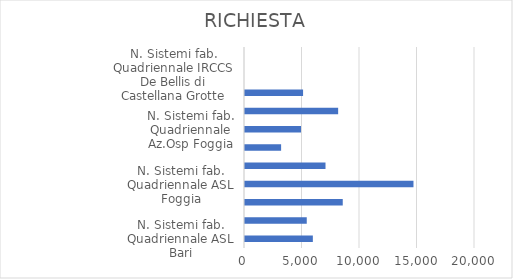
| Category | RICHIESTA |
|---|---|
| N. Sistemi fab. Quadriennale ASL Bari | 5900 |
| N. Sistemi fab. Quadriennale ASL BAT | 5370 |
| N. Sistemi fab. Quadriennale ASL Brindisi | 8500 |
| N. Sistemi fab. Quadriennale ASL Foggia | 14650 |
| N. Sistemi fab. Quadriennale ASL Lecce | 7000 |
| N. Sistemi fab. Quadriennale ASL Taranto | 3140 |
| N. Sistemi fab. Quadriennale Az.Osp Foggia | 4870 |
| N. Sistemi fab. Quadriennale Università Foggia | 8100 |
| N. Sistemi fab. Quadriennale Policlinico Bari | 5050 |
| N. Sistemi fab. Quadriennale IRCCS De Bellis di Castellana Grotte | 0 |
| N. Sistemi fab. Quadriennale IRCCS Giovanni Paolo II Bari | 0 |